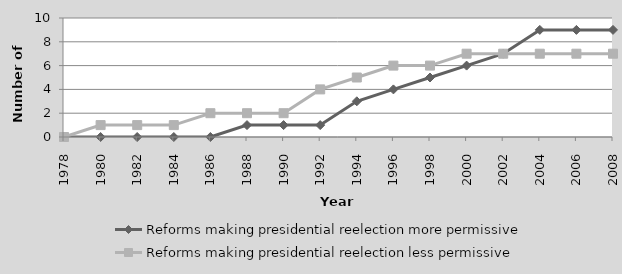
| Category | Reforms making presidential reelection more permissive | Reforms making presidential reelection less permissive |
|---|---|---|
| 1978.0 | 0 | 0 |
| 1980.0 | 0 | 1 |
| 1982.0 | 0 | 1 |
| 1984.0 | 0 | 1 |
| 1986.0 | 0 | 2 |
| 1988.0 | 1 | 2 |
| 1990.0 | 1 | 2 |
| 1992.0 | 1 | 4 |
| 1994.0 | 3 | 5 |
| 1996.0 | 4 | 6 |
| 1998.0 | 5 | 6 |
| 2000.0 | 6 | 7 |
| 2002.0 | 7 | 7 |
| 2004.0 | 9 | 7 |
| 2006.0 | 9 | 7 |
| 2008.0 | 9 | 7 |